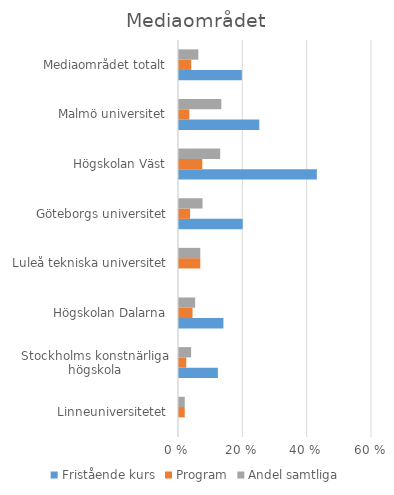
| Category | Fristående kurs | Program | Andel samtliga |
|---|---|---|---|
| Linneuniversitetet | 0 | 0.018 | 0.018 |
| Stockholms konstnärliga högskola | 0.121 | 0.023 | 0.038 |
| Högskolan Dalarna | 0.138 | 0.042 | 0.05 |
| Luleå tekniska universitet | 0 | 0.066 | 0.066 |
| Göteborgs universitet | 0.198 | 0.034 | 0.073 |
| Högskolan Väst | 0.429 | 0.072 | 0.128 |
| Malmö universitet | 0.25 | 0.032 | 0.132 |
| Mediaområdet totalt | 0.195 | 0.038 | 0.06 |